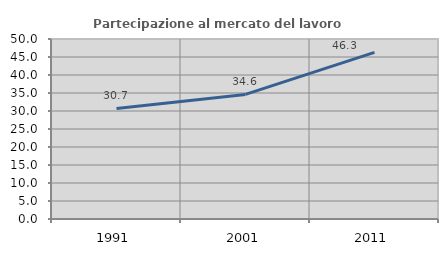
| Category | Partecipazione al mercato del lavoro  femminile |
|---|---|
| 1991.0 | 30.713 |
| 2001.0 | 34.606 |
| 2011.0 | 46.283 |